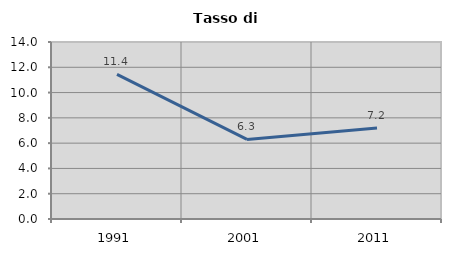
| Category | Tasso di disoccupazione   |
|---|---|
| 1991.0 | 11.434 |
| 2001.0 | 6.292 |
| 2011.0 | 7.189 |